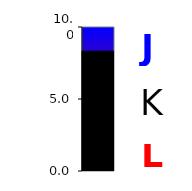
| Category | Series 0 |
|---|---|
| 0 | 8.323 |